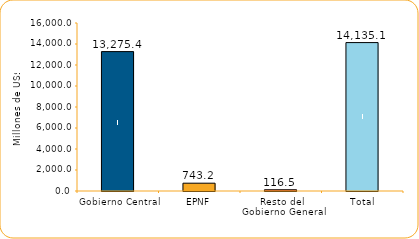
| Category | Series 1 |
|---|---|
| Gobierno Central | 13275.4 |
| EPNF | 743.2 |
| Resto del Gobierno General | 116.5 |
| Total | 14135.1 |